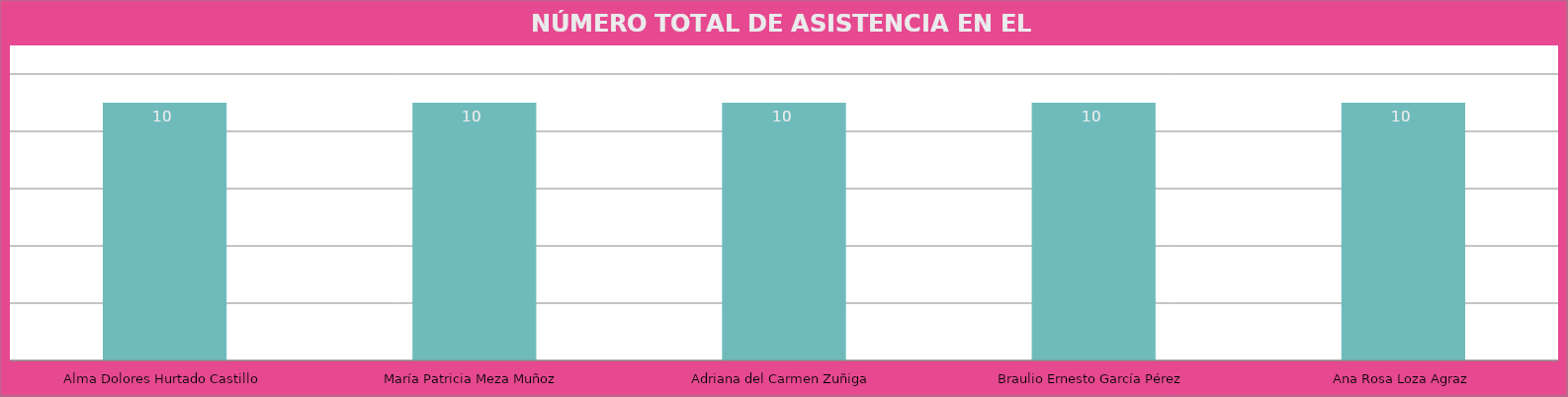
| Category | Alma Dolores Hurtado Castillo |
|---|---|
| Alma Dolores Hurtado Castillo | 10 |
| María Patricia Meza Muñoz | 10 |
| Adriana del Carmen Zuñiga | 10 |
| Braulio Ernesto García Pérez | 10 |
| Ana Rosa Loza Agraz | 10 |